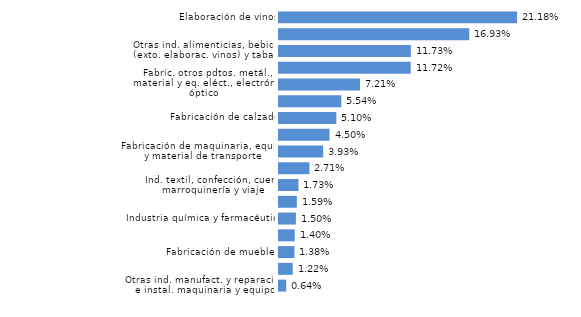
| Category | La Rioja |
|---|---|
| Otras ind. manufact. y reparación e instal. maquinaria y equipo | 0.006 |
| Forja y talleres | 0.012 |
| Fabricación de muebles | 0.014 |
| Metalurgia y fabricación elementos metálicos para construcción | 0.014 |
| Industria química y farmacéutica | 0.015 |
| Papel, artes gráficas y reproducción soportes grabados | 0.016 |
| Ind. textil, confección, cuero, marroquinería y viaje | 0.017 |
| Madera y corcho | 0.027 |
| Fabricación de maquinaria, equipo y material de transporte | 0.039 |
| Productos minerales no metálicos diversos | 0.045 |
| Fabricación de calzado | 0.051 |
| Caucho y materias plásticas | 0.055 |
| Fabric. otros pdtos. metál., material y eq. eléct., electrón. y óptico | 0.072 |
| Ind. cárnica, frutas, hortal., aceit. y grasas veget. y anim. e ind. láctea | 0.117 |
| Otras ind. alimenticias, bebidas (exto. elaborac. vinos) y tabaco | 0.117 |
| Industrias extractivas, energía, agua y residuos | 0.169 |
| Elaboración de vinos | 0.212 |